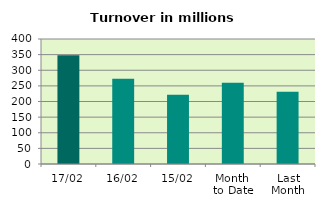
| Category | Series 0 |
|---|---|
| 17/02 | 347.61 |
| 16/02 | 272.704 |
| 15/02 | 221.339 |
| Month 
to Date | 259.9 |
| Last
Month | 231.348 |